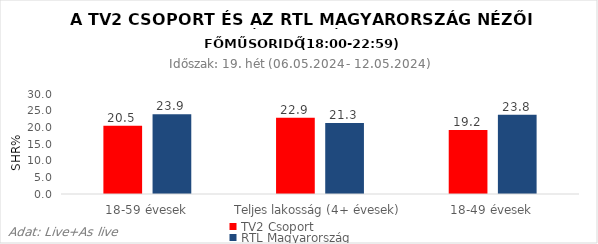
| Category | TV2 Csoport | RTL Magyarország |
|---|---|---|
| 18-59 évesek | 20.5 | 23.9 |
| Teljes lakosság (4+ évesek) | 22.9 | 21.3 |
| 18-49 évesek | 19.2 | 23.8 |